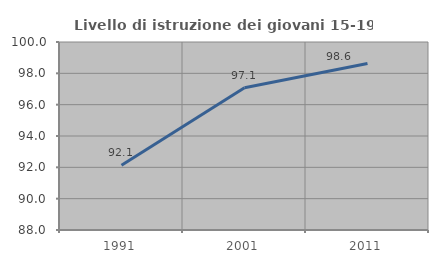
| Category | Livello di istruzione dei giovani 15-19 anni |
|---|---|
| 1991.0 | 92.134 |
| 2001.0 | 97.078 |
| 2011.0 | 98.63 |